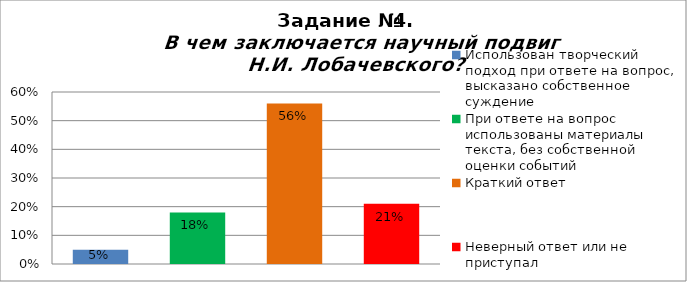
| Category | В чем заключается научный подвиг Н.И. Лобачевского? |
|---|---|
| Использован творческий подход при ответе на вопрос, высказано собственное суждение | 0.05 |
| При ответе на вопрос использованы материалы текста, без собственной оценки событий | 0.18 |
| Краткий ответ | 0.56 |
| Неверный ответ или не приступал | 0.21 |